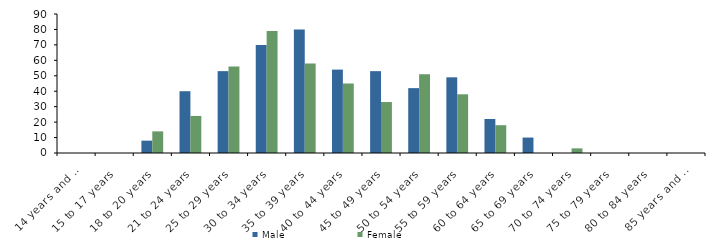
| Category | Male | Female |
|---|---|---|
| 14 years and under | 0 | 0 |
| 15 to 17 years | 0 | 0 |
| 18 to 20 years | 8 | 14 |
| 21 to 24 years | 40 | 24 |
| 25 to 29 years | 53 | 56 |
| 30 to 34 years | 70 | 79 |
| 35 to 39 years | 80 | 58 |
| 40 to 44 years | 54 | 45 |
| 45 to 49 years | 53 | 33 |
| 50 to 54 years | 42 | 51 |
| 55 to 59 years | 49 | 38 |
| 60 to 64 years | 22 | 18 |
| 65 to 69 years | 10 | 0 |
| 70 to 74 years | 0 | 3 |
| 75 to 79 years | 0 | 0 |
| 80 to 84 years | 0 | 0 |
| 85 years and over | 0 | 0 |